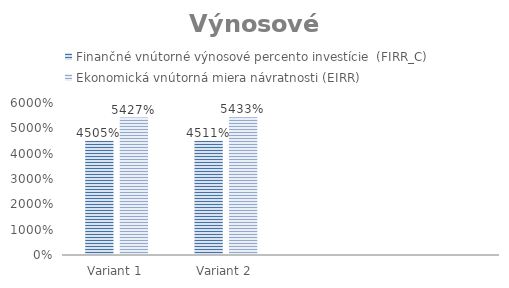
| Category | Finančné vnútorné výnosové percento investície  (FIRR_C) | Ekonomická vnútorná miera návratnosti (EIRR) |
|---|---|---|
| Variant 1 | 45.051 | 54.271 |
| Variant 2 | 45.115 | 54.334 |